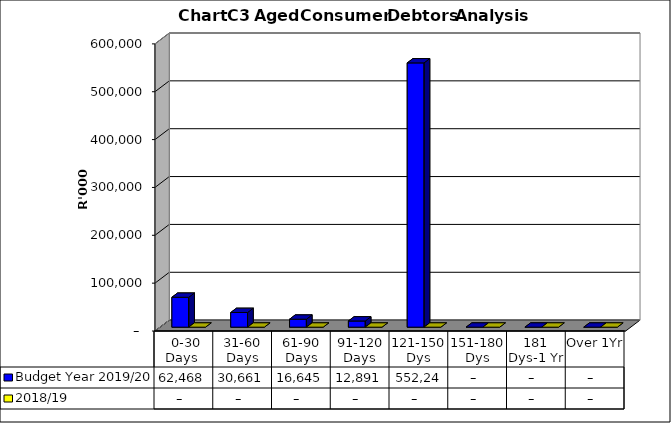
| Category | Budget Year 2019/20 | 2018/19 |
|---|---|---|
|  0-30 Days  | 62467814.17 | 0 |
| 31-60 Days | 30660695.36 | 0 |
| 61-90 Days | 16645040.89 | 0 |
| 91-120 Days | 12890610.38 | 0 |
| 121-150 Dys | 552247897.15 | 0 |
| 151-180 Dys | 0 | 0 |
| 181 Dys-1 Yr | 0 | 0 |
| Over 1Yr | 0 | 0 |